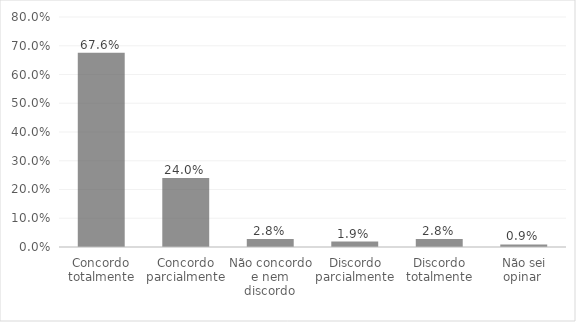
| Category | Series 0 |
|---|---|
| Concordo totalmente | 0.676 |
| Concordo parcialmente | 0.24 |
| Não concordo e nem discordo | 0.028 |
| Discordo parcialmente | 0.019 |
| Discordo totalmente | 0.028 |
| Não sei opinar  | 0.009 |